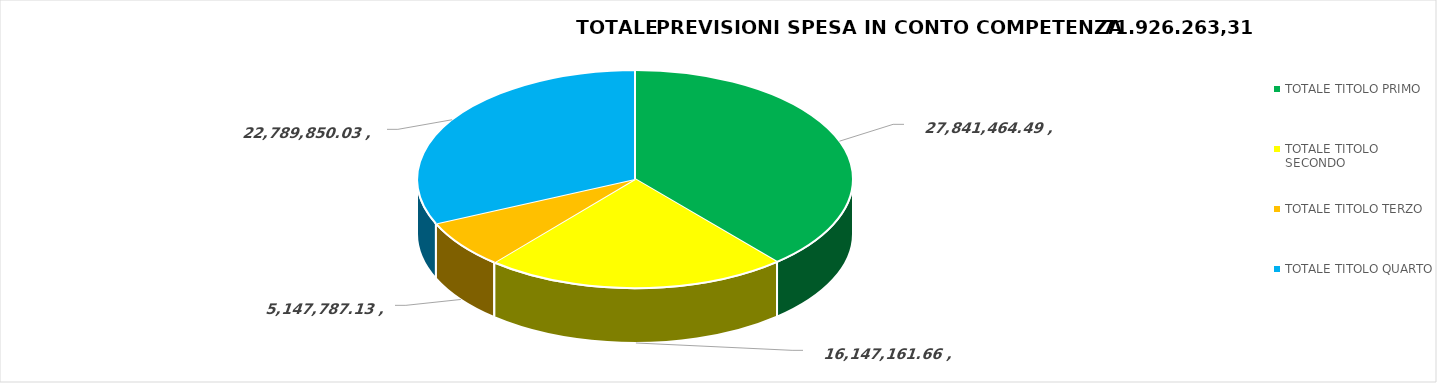
| Category | Series 0 |
|---|---|
| TOTALE TITOLO PRIMO | 27841464.49 |
| TOTALE TITOLO SECONDO | 16147161.66 |
| TOTALE TITOLO TERZO | 5147787.13 |
| TOTALE TITOLO QUARTO | 22789850.03 |